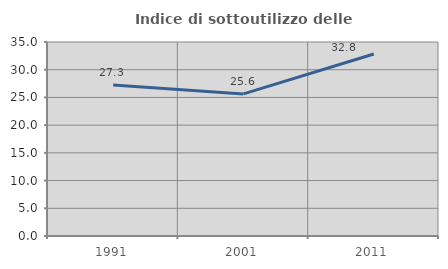
| Category | Indice di sottoutilizzo delle abitazioni  |
|---|---|
| 1991.0 | 27.25 |
| 2001.0 | 25.635 |
| 2011.0 | 32.832 |